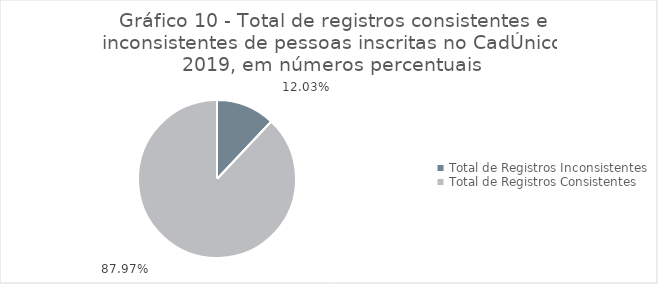
| Category | Series 0 |
|---|---|
| Total de Registros Inconsistentes | 0.12 |
| Total de Registros Consistentes | 0.88 |